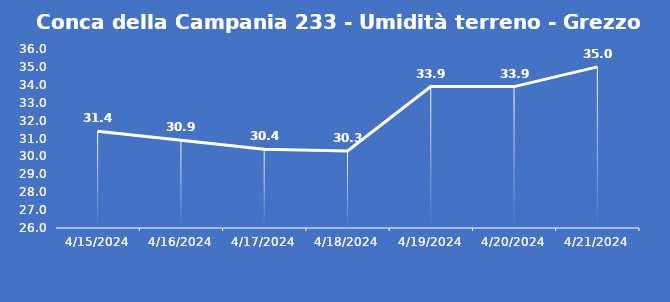
| Category | Conca della Campania 233 - Umidità terreno - Grezzo (%VWC) |
|---|---|
| 4/15/24 | 31.4 |
| 4/16/24 | 30.9 |
| 4/17/24 | 30.4 |
| 4/18/24 | 30.3 |
| 4/19/24 | 33.9 |
| 4/20/24 | 33.9 |
| 4/21/24 | 35 |